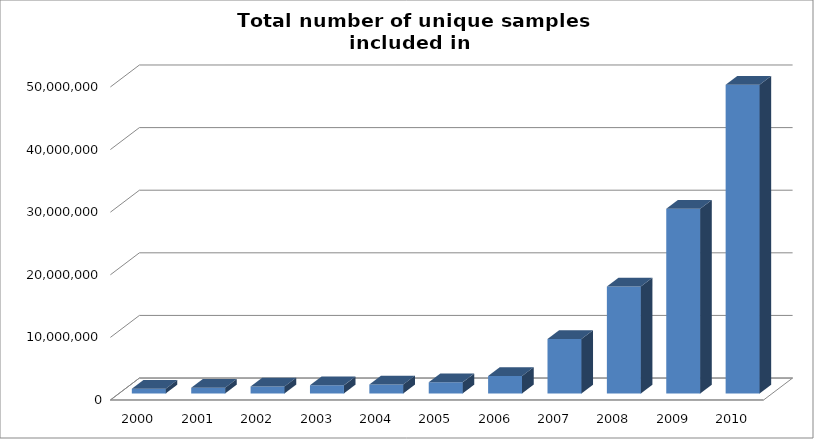
| Category | Series 0 |
|---|---|
| 2000.0 | 755338 |
| 2001.0 | 910899 |
| 2002.0 | 1109957 |
| 2003.0 | 1288738 |
| 2004.0 | 1431140 |
| 2005.0 | 1764947 |
| 2006.0 | 2787844 |
| 2007.0 | 8705343 |
| 2008.0 | 17084275 |
| 2009.0 | 29481109 |
| 2010.0 | 49295341 |